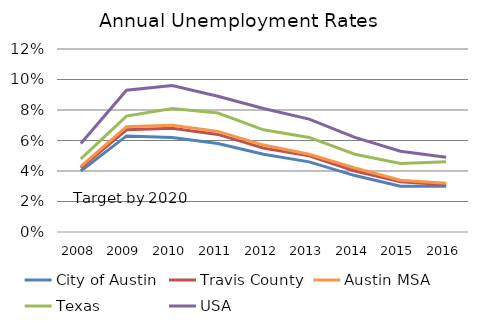
| Category | City of Austin | Travis County | Austin MSA | Texas | USA |
|---|---|---|---|---|---|
| 2008.0 | 0.04 | 0.042 | 0.043 | 0.048 | 0.058 |
| 2009.0 | 0.063 | 0.067 | 0.069 | 0.076 | 0.093 |
| 2010.0 | 0.062 | 0.068 | 0.07 | 0.081 | 0.096 |
| 2011.0 | 0.058 | 0.064 | 0.066 | 0.078 | 0.089 |
| 2012.0 | 0.051 | 0.055 | 0.057 | 0.067 | 0.081 |
| 2013.0 | 0.046 | 0.05 | 0.051 | 0.062 | 0.074 |
| 2014.0 | 0.037 | 0.04 | 0.042 | 0.051 | 0.062 |
| 2015.0 | 0.03 | 0.033 | 0.034 | 0.045 | 0.053 |
| 2016.0 | 0.03 | 0.031 | 0.032 | 0.046 | 0.049 |